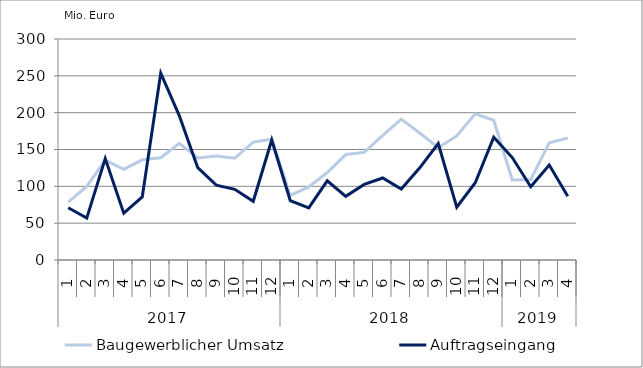
| Category | Baugewerblicher Umsatz | Auftragseingang |
|---|---|---|
| 0 | 78446.78 | 70908.903 |
| 1 | 99841.908 | 56868.408 |
| 2 | 135679.867 | 137790.423 |
| 3 | 123004.403 | 63637.761 |
| 4 | 136010.071 | 85644.63 |
| 5 | 138859.308 | 253791.552 |
| 6 | 158353.879 | 196034.198 |
| 7 | 138510.315 | 125319.873 |
| 8 | 141109.925 | 101690.626 |
| 9 | 138067.098 | 95966.626 |
| 10 | 160064.454 | 79701.993 |
| 11 | 163969.017 | 162878.607 |
| 12 | 87640.529 | 80684.627 |
| 13 | 99259.455 | 70746.763 |
| 14 | 118764.324 | 107538.747 |
| 15 | 143144.178 | 86374.619 |
| 16 | 146070.782 | 102661.329 |
| 17 | 169150.753 | 111287.709 |
| 18 | 191277.885 | 96286.662 |
| 19 | 172425.535 | 125142.495 |
| 20 | 152354.98 | 158112.302 |
| 21 | 168372.756 | 71808.619 |
| 22 | 198558.472 | 104904.147 |
| 23 | 189665.914 | 166653.461 |
| 24 | 108616.605 | 139065.287 |
| 25 | 109331.58 | 99318.609 |
| 26 | 159117.81 | 129002.041 |
| 27 | 165654.287 | 86579.2 |